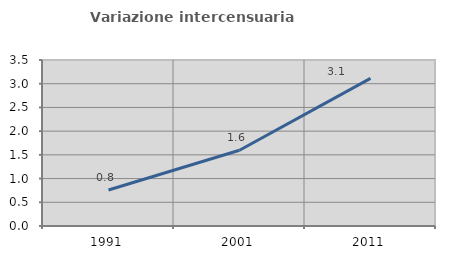
| Category | Variazione intercensuaria annua |
|---|---|
| 1991.0 | 0.759 |
| 2001.0 | 1.597 |
| 2011.0 | 3.112 |